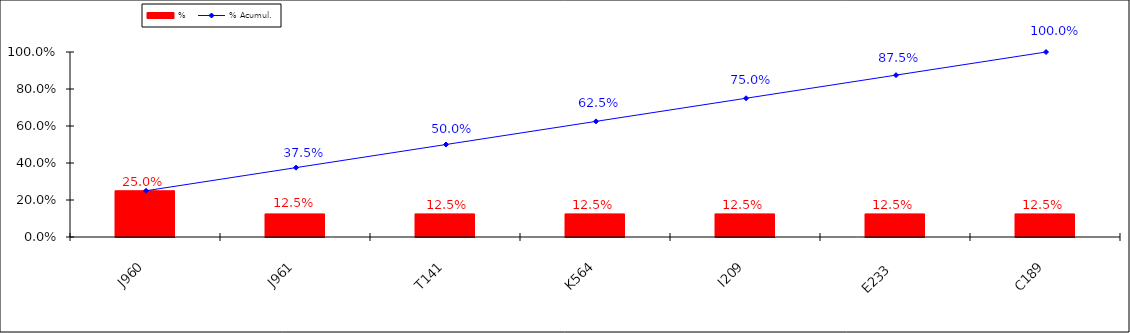
| Category | % |
|---|---|
| J960 | 0.25 |
| J961 | 0.125 |
| T141 | 0.125 |
| K564 | 0.125 |
| I209 | 0.125 |
| E233 | 0.125 |
| C189 | 0.125 |